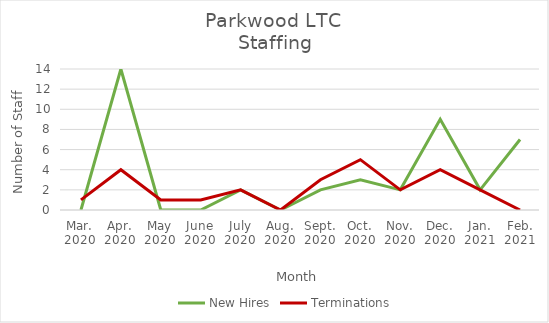
| Category | New Hires | Terminations |
|---|---|---|
| Mar.
2020 | 0 | 1 |
| Apr.
2020 | 14 | 4 |
| May
2020 | 0 | 1 |
| June
2020 | 0 | 1 |
| July
2020 | 2 | 2 |
| Aug.
2020 | 0 | 0 |
| Sept.
2020 | 2 | 3 |
| Oct.
2020 | 3 | 5 |
| Nov.
2020 | 2 | 2 |
| Dec.
2020 | 9 | 4 |
| Jan.
2021 | 2 | 2 |
| Feb.
2021 | 7 | 0 |